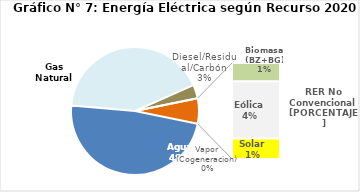
| Category | Series 0 |
|---|---|
| Agua | 2139.413 |
| Gas Natural | 1863.51 |
| Diesel/Residual/Carbón | 152.058 |
| Vapor (Cogeneracion) | 0.21 |
| Biomasa (BZ+BG) | 54.789 |
| Eólica | 169.568 |
| Solar | 61.047 |